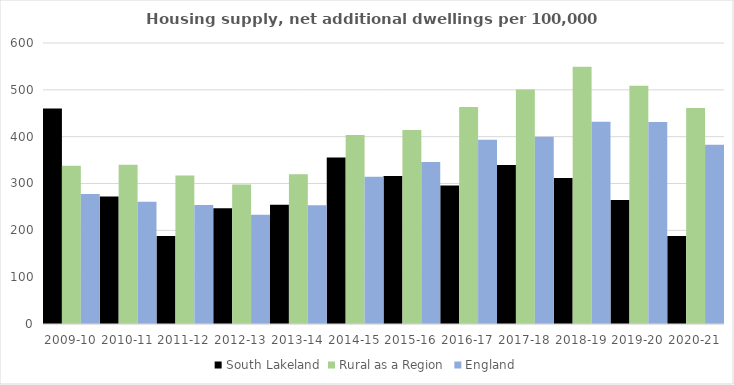
| Category | South Lakeland | Rural as a Region | England |
|---|---|---|---|
| 2009-10 | 460.11 | 337.852 | 277.548 |
| 2010-11 | 272.126 | 340.105 | 260.994 |
| 2011-12 | 188.019 | 317.04 | 254.007 |
| 2012-13 | 247.238 | 297.763 | 233.153 |
| 2013-14 | 254.843 | 319.835 | 253.602 |
| 2014-15 | 355.552 | 403.796 | 314.256 |
| 2015-16 | 316.065 | 414.091 | 346.154 |
| 2016-17 | 295.687 | 463.209 | 393.256 |
| 2017-18 | 339.337 | 500.68 | 399.646 |
| 2018-19 | 311.866 | 549.491 | 432.099 |
| 2019-20 | 264.54 | 508.493 | 431.187 |
| 2020-21 | 187.789 | 461.114 | 382.827 |